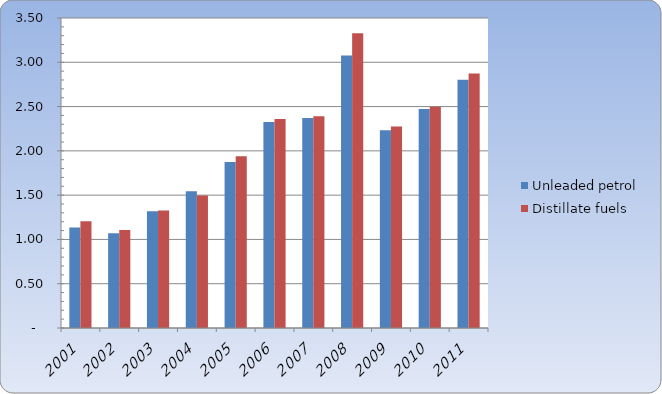
| Category | Unleaded petrol | Distillate fuels |
|---|---|---|
| 2001.0 | 1.134 | 1.206 |
| 2002.0 | 1.069 | 1.105 |
| 2003.0 | 1.317 | 1.326 |
| 2004.0 | 1.544 | 1.496 |
| 2005.0 | 1.875 | 1.939 |
| 2006.0 | 2.325 | 2.36 |
| 2007.0 | 2.372 | 2.391 |
| 2008.0 | 3.076 | 3.327 |
| 2009.0 | 2.234 | 2.274 |
| 2010.0 | 2.474 | 2.497 |
| 2011.0 | 2.802 | 2.873 |